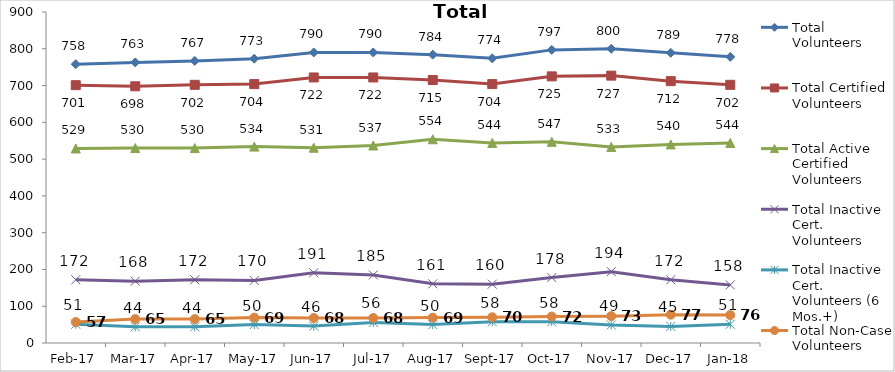
| Category | Total Volunteers | Total Certified Volunteers | Total Active Certified Volunteers | Total Inactive Cert. Volunteers | Total Inactive Cert. Volunteers (6 Mos.+) | Total Non-Case Volunteers |
|---|---|---|---|---|---|---|
| 2017-02-01 | 758 | 701 | 529 | 172 | 51 | 57 |
| 2017-03-01 | 763 | 698 | 530 | 168 | 44 | 65 |
| 2017-04-01 | 767 | 702 | 530 | 172 | 44 | 65 |
| 2017-05-01 | 773 | 704 | 534 | 170 | 50 | 69 |
| 2017-06-01 | 790 | 722 | 531 | 191 | 46 | 68 |
| 2017-07-01 | 790 | 722 | 537 | 185 | 56 | 68 |
| 2017-08-01 | 784 | 715 | 554 | 161 | 50 | 69 |
| 2017-09-01 | 774 | 704 | 544 | 160 | 58 | 70 |
| 2017-10-01 | 797 | 725 | 547 | 178 | 58 | 72 |
| 2017-11-01 | 800 | 727 | 533 | 194 | 49 | 73 |
| 2017-12-01 | 789 | 712 | 540 | 172 | 45 | 77 |
| 2018-01-01 | 778 | 702 | 544 | 158 | 51 | 76 |